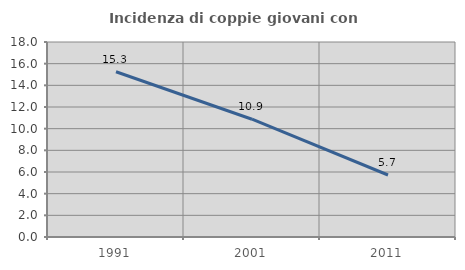
| Category | Incidenza di coppie giovani con figli |
|---|---|
| 1991.0 | 15.251 |
| 2001.0 | 10.873 |
| 2011.0 | 5.723 |